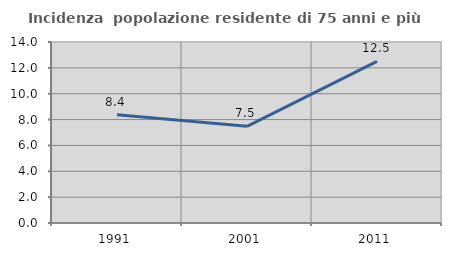
| Category | Incidenza  popolazione residente di 75 anni e più |
|---|---|
| 1991.0 | 8.382 |
| 2001.0 | 7.479 |
| 2011.0 | 12.5 |